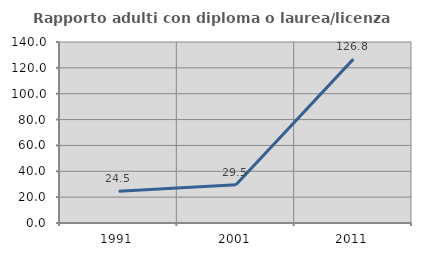
| Category | Rapporto adulti con diploma o laurea/licenza media  |
|---|---|
| 1991.0 | 24.49 |
| 2001.0 | 29.541 |
| 2011.0 | 126.772 |